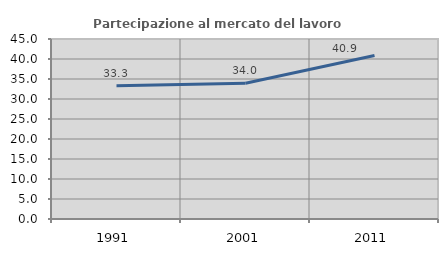
| Category | Partecipazione al mercato del lavoro  femminile |
|---|---|
| 1991.0 | 33.333 |
| 2001.0 | 33.955 |
| 2011.0 | 40.891 |